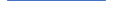
| Category | Series 0 |
|---|---|
| 0 | 0 |
| 1 | 0 |
| 2 | 0 |
| 3 | 0 |
| 4 | 0 |
| 5 | 1 |
| 6 | 0 |
| 7 | 2 |
| 8 | 0 |